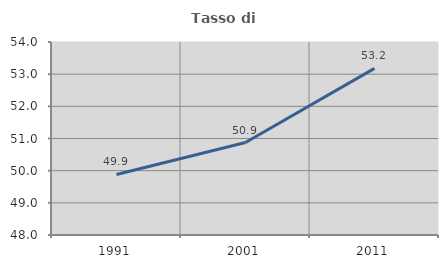
| Category | Tasso di occupazione   |
|---|---|
| 1991.0 | 49.883 |
| 2001.0 | 50.874 |
| 2011.0 | 53.18 |